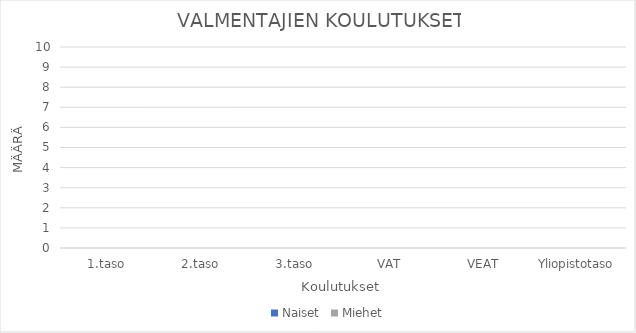
| Category | Naiset | Miehet |
|---|---|---|
| 1.taso | 0 | 0 |
| 2.taso | 0 | 0 |
| 3.taso | 0 | 0 |
| VAT | 0 | 0 |
| VEAT | 0 | 0 |
| Yliopistotaso | 0 | 0 |